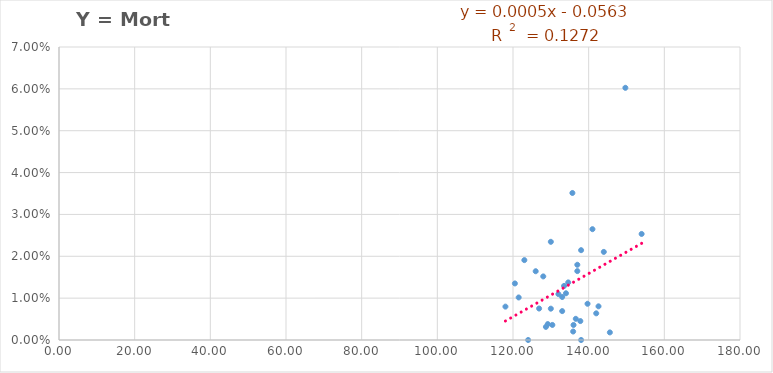
| Category | Y = Mort /año |
|---|---|
| 133.0 | 0.007 |
| 139.7 | 0.009 |
| 144.0 | 0.021 |
| 132.0 | 0.011 |
| 128.0 | 0.015 |
| 126.0 | 0.016 |
| 130.0 | 0.007 |
| 118.0 | 0.008 |
| 135.9 | 0.002 |
| 136.0 | 0.004 |
| 120.5 | 0.014 |
| 136.6 | 0.005 |
| 130.0 | 0.023 |
| 128.7 | 0.003 |
| 135.7 | 0.035 |
| 123.0 | 0.019 |
| 121.5 | 0.01 |
| 126.9 | 0.008 |
| 138.0 | 0 |
| 142.6 | 0.008 |
| 154.0 | 0.025 |
| 138.0 | 0.021 |
| 137.0 | 0.016 |
| 133.0 | 0.01 |
| 134.0 | 0.011 |
| 124.0 | 0 |
| 145.6 | 0.002 |
| 137.8 | 0.005 |
| 133.5 | 0.013 |
| 142.0 | 0.006 |
| 141.0 | 0.026 |
| 130.4 | 0.004 |
| 149.7 | 0.06 |
| 137.0 | 0.018 |
| 134.6 | 0.014 |
| 129.2 | 0.004 |